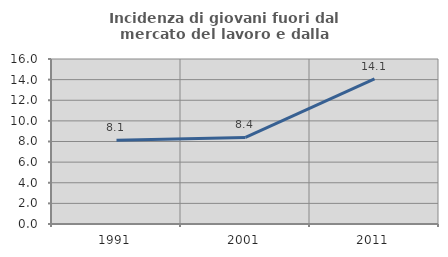
| Category | Incidenza di giovani fuori dal mercato del lavoro e dalla formazione  |
|---|---|
| 1991.0 | 8.13 |
| 2001.0 | 8.397 |
| 2011.0 | 14.062 |